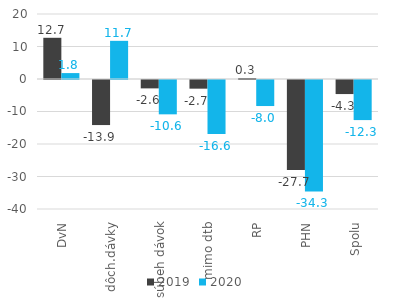
| Category | 2019 | 2020 |
|---|---|---|
| DvN | 12.677 | 1.82 |
| dôch.dávky | -13.864 | 11.741 |
| súbeh dávok | -2.579 | -10.565 |
| mimo dtb | -2.666 | -16.596 |
| RP | 0.308 | -8.011 |
| PHN | -27.717 | -34.283 |
| Spolu | -4.327 | -12.334 |